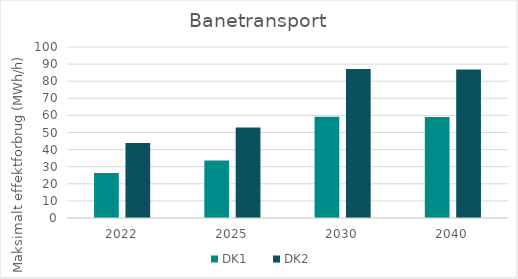
| Category | DK1 | DK2 |
|---|---|---|
| 2022.0 | 26.385 | 43.813 |
| 2025.0 | 33.672 | 52.914 |
| 2030.0 | 59.263 | 87.068 |
| 2040.0 | 59.134 | 86.879 |